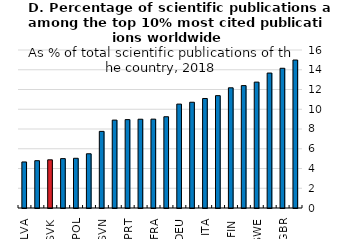
| Category | 2020 |
|---|---|
| LVA | 4.662 |
| LTU | 4.79 |
| SVK | 4.88 |
| CZE | 5 |
| POL | 5.034 |
| HUN | 5.491 |
| SVN | 7.761 |
| GRC | 8.901 |
| PRT | 8.95 |
| EST | 8.99 |
| FRA | 8.999 |
| ESP | 9.241 |
| DEU | 10.521 |
| AUT | 10.709 |
| ITA | 11.089 |
| IRL | 11.378 |
| FIN | 12.172 |
| LUX | 12.394 |
| SWE | 12.747 |
| DNK | 13.665 |
| GBR | 14.149 |
| NLD | 14.985 |